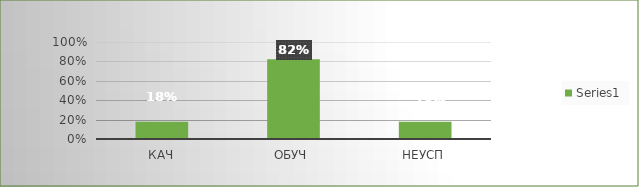
| Category | Series 0 |
|---|---|
| кач | 0.179 |
| обуч | 0.821 |
| неусп | 0.179 |